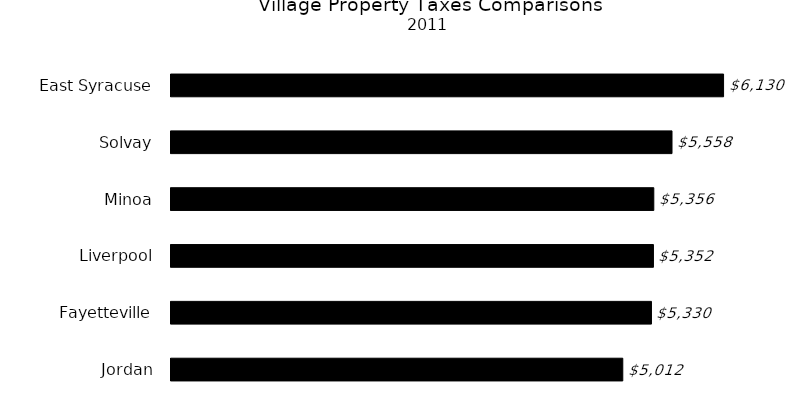
| Category | Series 0 |
|---|---|
| Jordan | 5012 |
| Fayetteville | 5330 |
| Liverpool | 5352 |
| Minoa | 5356 |
| Solvay | 5558 |
| East Syracuse | 6130 |